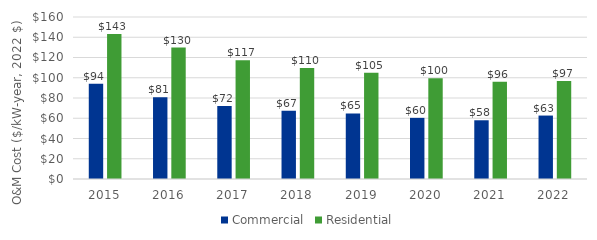
| Category | Commercial | Residential |
|---|---|---|
| 2015.0 | 93.987 | 143.161 |
| 2016.0 | 80.771 | 129.763 |
| 2017.0 | 72.218 | 117.193 |
| 2018.0 | 67.379 | 109.597 |
| 2019.0 | 64.738 | 105.059 |
| 2020.0 | 60.385 | 99.543 |
| 2021.0 | 58.002 | 96.009 |
| 2022.0 | 62.658 | 96.876 |